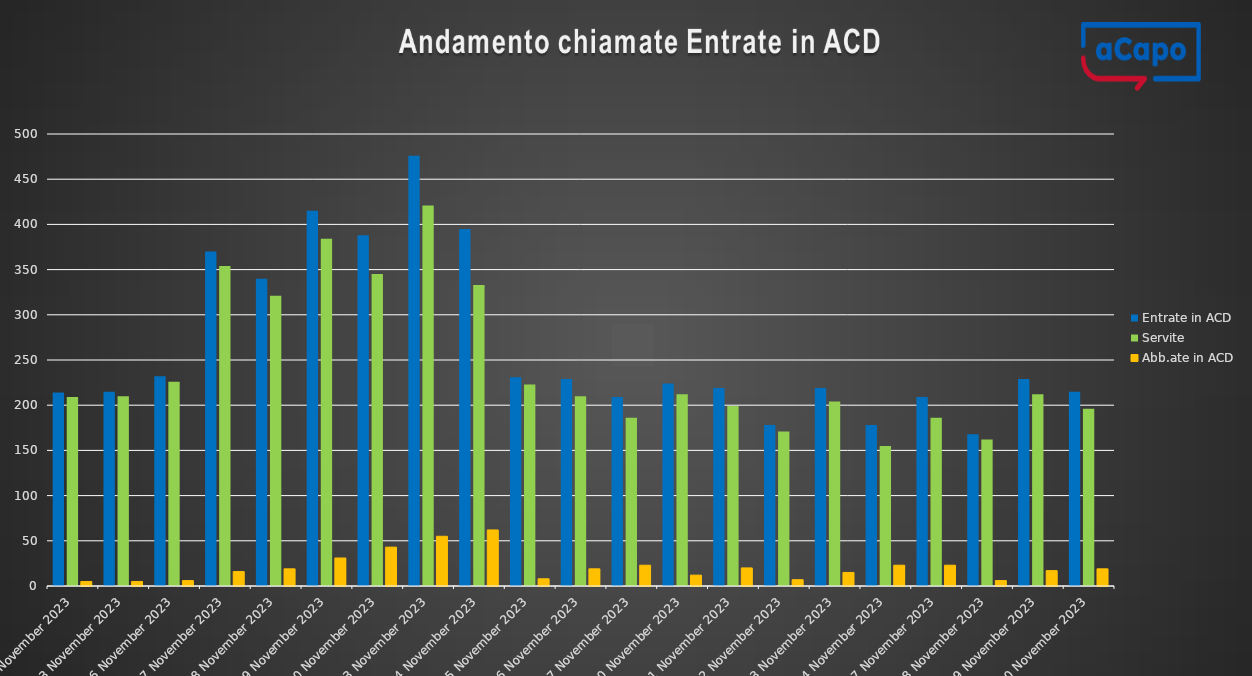
| Category | Entrate in ACD | Servite | Abb.ate in ACD |
|---|---|---|---|
| 2023-11-02 | 214 | 209 | 5 |
| 2023-11-03 | 215 | 210 | 5 |
| 2023-11-06 | 232 | 226 | 6 |
| 2023-11-07 | 370 | 354 | 16 |
| 2023-11-08 | 340 | 321 | 19 |
| 2023-11-09 | 415 | 384 | 31 |
| 2023-11-10 | 388 | 345 | 43 |
| 2023-11-13 | 476 | 421 | 55 |
| 2023-11-14 | 395 | 333 | 62 |
| 2023-11-15 | 231 | 223 | 8 |
| 2023-11-16 | 229 | 210 | 19 |
| 2023-11-17 | 209 | 186 | 23 |
| 2023-11-20 | 224 | 212 | 12 |
| 2023-11-21 | 219 | 199 | 20 |
| 2023-11-22 | 178 | 171 | 7 |
| 2023-11-23 | 219 | 204 | 15 |
| 2023-11-24 | 178 | 155 | 23 |
| 2023-11-27 | 209 | 186 | 23 |
| 2023-11-28 | 168 | 162 | 6 |
| 2023-11-29 | 229 | 212 | 17 |
| 2023-11-30 | 215 | 196 | 19 |